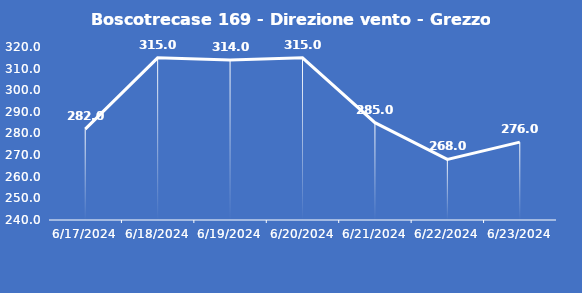
| Category | Boscotrecase 169 - Direzione vento - Grezzo (°N) |
|---|---|
| 6/17/24 | 282 |
| 6/18/24 | 315 |
| 6/19/24 | 314 |
| 6/20/24 | 315 |
| 6/21/24 | 285 |
| 6/22/24 | 268 |
| 6/23/24 | 276 |